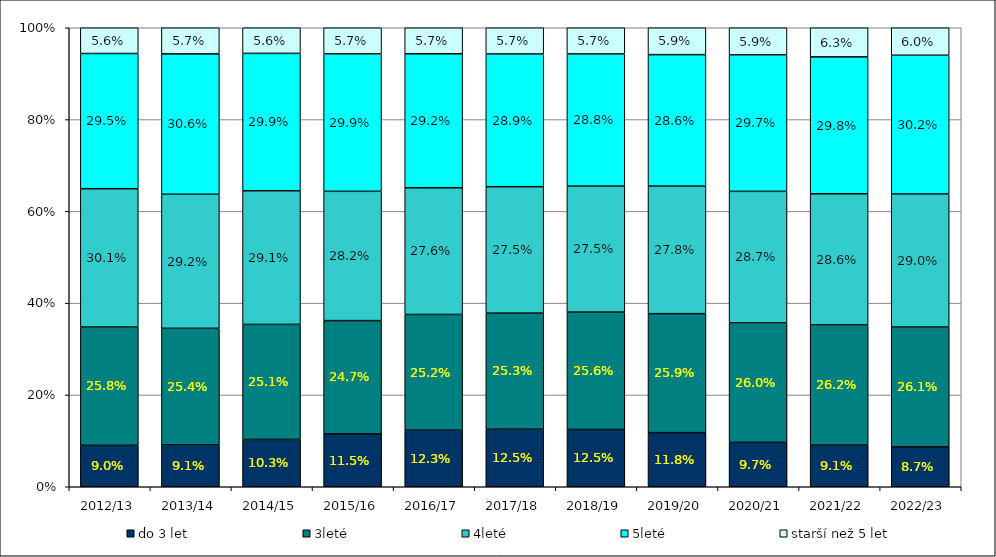
| Category | do 3 let | 3leté | 4leté | 5leté | starší než 5 let |
|---|---|---|---|---|---|
| 2012/13 | 0.09 | 0.258 | 0.301 | 0.295 | 0.056 |
| 2013/14 | 0.091 | 0.254 | 0.292 | 0.306 | 0.057 |
| 2014/15 | 0.103 | 0.251 | 0.291 | 0.299 | 0.056 |
| 2015/16 | 0.115 | 0.247 | 0.282 | 0.299 | 0.057 |
| 2016/17 | 0.123 | 0.252 | 0.276 | 0.292 | 0.057 |
| 2017/18 | 0.125 | 0.253 | 0.275 | 0.289 | 0.057 |
| 2018/19 | 0.125 | 0.256 | 0.275 | 0.288 | 0.057 |
| 2019/20 | 0.118 | 0.259 | 0.278 | 0.286 | 0.059 |
| 2020/21 | 0.097 | 0.26 | 0.287 | 0.297 | 0.059 |
| 2021/22 | 0.091 | 0.262 | 0.286 | 0.298 | 0.063 |
| 2022/23 | 0.087 | 0.261 | 0.29 | 0.302 | 0.06 |